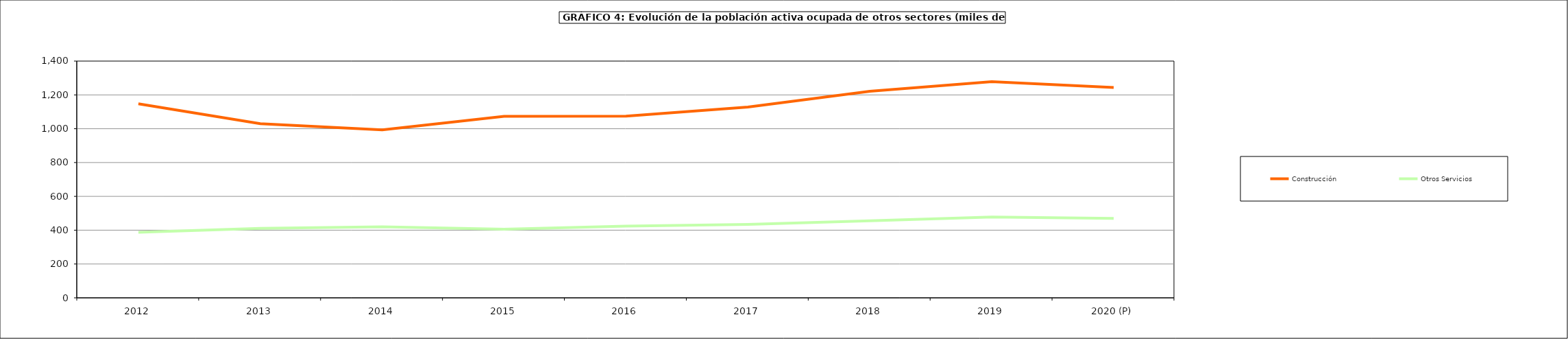
| Category | Construcción | Otros Servicios |
|---|---|---|
| 2012 | 1147.575 | 387.25 |
| 2013 | 1029.6 | 410.85 |
| 2014 | 993.5 | 419.6 |
| 2015 | 1073.65 | 405.475 |
| 2016 | 1073.9 | 424.325 |
| 2017 | 1128.3 | 434.6 |
| 2018 | 1221.8 | 455.3 |
| 2019 | 1277.9 | 477.775 |
| 2020 (P) | 1244.1 | 469.7 |